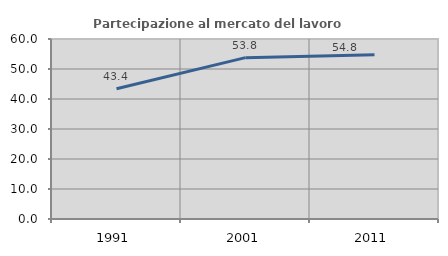
| Category | Partecipazione al mercato del lavoro  femminile |
|---|---|
| 1991.0 | 43.407 |
| 2001.0 | 53.783 |
| 2011.0 | 54.757 |